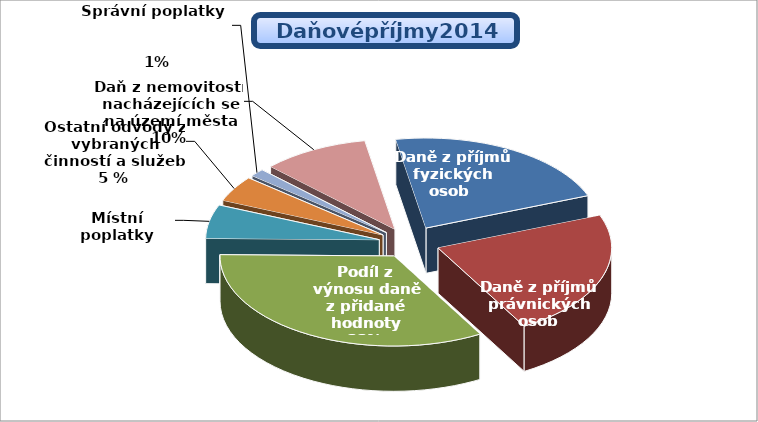
| Category |  DAŇOVÉ PŘÍJMY |
|---|---|
| Daně z příjmů fyzických osob  | 159000 |
| Daně z příjmů právnických osob | 164000 |
| Podíl z výnosu daně z přidané hodnoty | 243000 |
| Poplatky a odvody v oblasti životního prostředí  | 20 |
| Místní poplatky | 44000 |
| Ostatní odvody z vybraných činností a služeb | 33500 |
| Správní poplatky                                          | 10000 |
| Daň z nemovitostí nacházejících se na území města | 72000 |